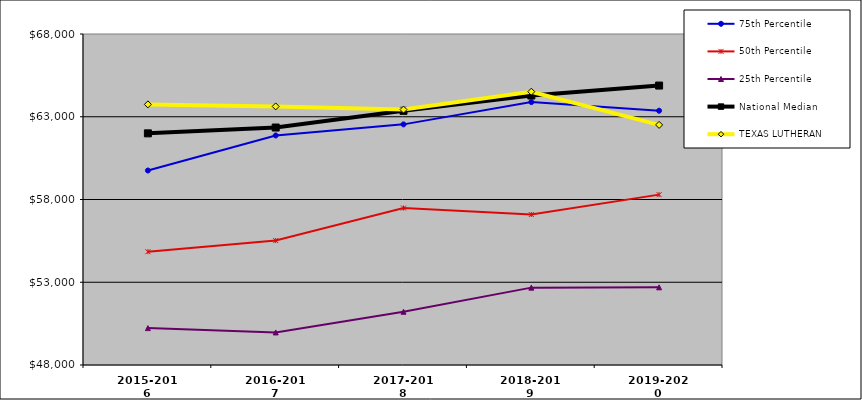
| Category | 75th Percentile | 50th Percentile | 25th Percentile | National Median | TEXAS LUTHERAN |
|---|---|---|---|---|---|
| 2015-2016 | 59751 | 54846 | 50229 | 61996.5 | 63747 |
| 2016-2017 | 61869 | 55518 | 49968 | 62349 | 63624 |
| 2017-2018 | 62540 | 57485 | 51217 | 63357 | 63432 |
| 2018-2019 | 63885 | 57092 | 52675 | 64282.5 | 64514 |
| 2019-2020 | 63364 | 58294 | 52693 | 64884.5 | 62508 |